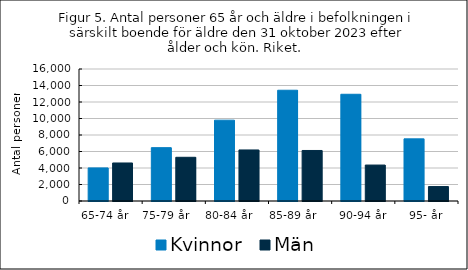
| Category | Kvinnor  | Män   |
|---|---|---|
| 65-74 år    | 4009 | 4608 |
| 75-79 år       | 6467 | 5298 |
| 80-84 år      | 9799 | 6189 |
| 85-89 år        | 13426 | 6125 |
| 90-94 år | 12936 | 4357 |
| 95- år | 7532 | 1751 |